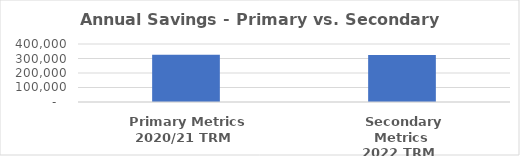
| Category | Series 0 |
|---|---|
|  Primary Metrics
2020/21 TRM  | 326187 |
|  Secondary Metrics
2022 TRM  | 323437 |